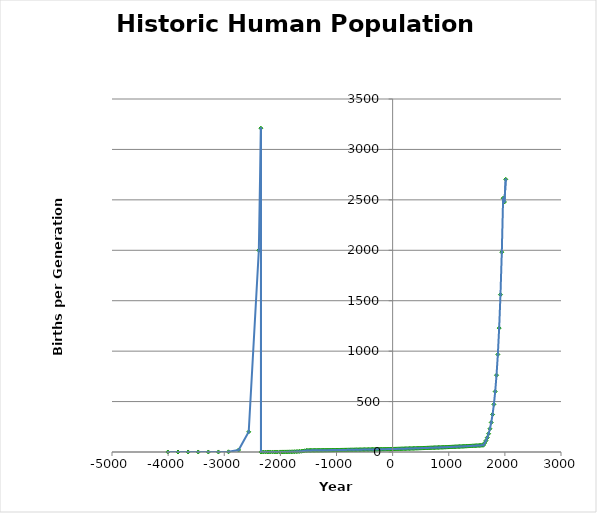
| Category | Series 0 |
|---|---|
| -4004.0 | 0 |
| -3824.0 | 0 |
| -3644.0 | 0 |
| -3464.0 | 0.002 |
| -3284.0 | 0.02 |
| -3104.0 | 0.2 |
| -2924.0 | 2 |
| -2744.0 | 20 |
| -2564.0 | 200 |
| -2384.0 | 2000 |
| -2347.0 | 3210.595 |
| -2346.0 | 0 |
| -2304.75 | 0 |
| -2263.5 | 0 |
| -2222.25 | 0 |
| -2181.0 | 0.002 |
| -2139.75 | 0.006 |
| -2098.5 | 0.025 |
| -2057.25 | 0.098 |
| -2014.0 | 0.421 |
| -1984.3 | 0.522 |
| -1954.6 | 0.652 |
| -1924.9 | 0.815 |
| -1895.2 | 1.019 |
| -1865.5 | 1.274 |
| -1835.8 | 1.592 |
| -1806.1 | 1.99 |
| -1776.4 | 2.488 |
| -1746.7 | 3.11 |
| -1717.0 | 3.887 |
| -1687.3 | 4.859 |
| -1657.6 | 6.074 |
| -1626.4 | 7.679 |
| -1595.2 | 9.707 |
| -1564.0 | 12.271 |
| -1532.8 | 15.513 |
| -1509.3 | 15.668 |
| -1485.8 | 15.825 |
| -1462.3 | 15.983 |
| -1438.8 | 16.143 |
| -1415.3 | 16.304 |
| -1391.8 | 16.467 |
| -1368.3 | 16.632 |
| -1344.8 | 16.798 |
| -1321.3 | 16.966 |
| -1297.8 | 17.136 |
| -1274.3 | 17.307 |
| -1250.8 | 17.48 |
| -1227.3 | 17.655 |
| -1203.8 | 17.832 |
| -1180.3 | 18.01 |
| -1156.8 | 18.19 |
| -1133.3 | 18.372 |
| -1109.8 | 18.556 |
| -1086.3 | 18.741 |
| -1062.8 | 18.929 |
| -1039.3 | 19.118 |
| -1015.8 | 19.309 |
| -992.299999999999 | 19.502 |
| -968.799999999999 | 19.697 |
| -945.299999999999 | 19.894 |
| -921.799999999999 | 20.093 |
| -898.299999999999 | 20.294 |
| -874.799999999999 | 20.497 |
| -851.299999999999 | 20.702 |
| -827.799999999999 | 20.909 |
| -804.299999999999 | 21.118 |
| -780.799999999999 | 21.329 |
| -757.299999999999 | 21.543 |
| -733.799999999999 | 21.758 |
| -710.299999999999 | 21.976 |
| -686.799999999999 | 22.195 |
| -663.299999999999 | 22.417 |
| -639.799999999999 | 22.642 |
| -616.299999999999 | 22.868 |
| -592.799999999999 | 23.097 |
| -569.299999999999 | 23.328 |
| -545.799999999999 | 23.561 |
| -522.299999999999 | 23.796 |
| -498.799999999999 | 24.034 |
| -475.299999999999 | 24.275 |
| -451.799999999999 | 24.518 |
| -428.299999999999 | 24.763 |
| -404.799999999999 | 25.01 |
| -381.299999999999 | 25.26 |
| -357.799999999999 | 25.513 |
| -334.299999999999 | 25.768 |
| -310.799999999999 | 26.026 |
| -287.299999999999 | 26.286 |
| -263.799999999999 | 26.549 |
| -240.299999999999 | 26.814 |
| -216.799999999999 | 27.083 |
| -193.299999999999 | 27.353 |
| -169.799999999999 | 27.627 |
| -146.299999999999 | 27.903 |
| -122.799999999999 | 28.182 |
| -99.2999999999993 | 28.464 |
| -75.7999999999993 | 28.749 |
| -52.2999999999993 | 29.036 |
| -28.7999999999993 | 29.327 |
| -5.29999999999927 | 29.62 |
| 18.2000000000007 | 29.916 |
| 41.7000000000007 | 30.275 |
| 65.2000000000007 | 30.638 |
| 88.7000000000007 | 31.006 |
| 112.200000000001 | 31.378 |
| 135.700000000001 | 31.755 |
| 159.200000000001 | 32.136 |
| 182.700000000001 | 32.521 |
| 206.200000000001 | 32.911 |
| 229.700000000001 | 33.306 |
| 253.200000000001 | 33.706 |
| 276.700000000001 | 34.111 |
| 300.200000000001 | 34.52 |
| 323.700000000001 | 34.934 |
| 347.200000000001 | 35.353 |
| 370.700000000001 | 35.778 |
| 394.200000000001 | 36.207 |
| 417.700000000001 | 36.641 |
| 441.200000000001 | 37.081 |
| 464.700000000001 | 37.526 |
| 488.200000000001 | 37.976 |
| 511.700000000001 | 38.432 |
| 535.200000000001 | 38.893 |
| 558.700000000001 | 39.36 |
| 582.200000000001 | 39.832 |
| 605.700000000001 | 40.31 |
| 629.200000000001 | 40.794 |
| 652.700000000001 | 41.284 |
| 676.200000000001 | 41.779 |
| 699.700000000001 | 42.28 |
| 723.200000000001 | 42.788 |
| 746.700000000001 | 43.301 |
| 770.200000000001 | 43.821 |
| 793.700000000001 | 44.347 |
| 817.200000000001 | 44.879 |
| 840.700000000001 | 45.417 |
| 864.200000000001 | 45.962 |
| 887.700000000001 | 46.514 |
| 911.200000000001 | 47.072 |
| 934.700000000001 | 47.637 |
| 958.200000000001 | 48.209 |
| 981.700000000001 | 48.787 |
| 1005.2 | 49.372 |
| 1028.7 | 49.965 |
| 1052.2 | 50.565 |
| 1075.7 | 51.171 |
| 1099.2 | 51.785 |
| 1122.7 | 52.407 |
| 1146.2 | 53.036 |
| 1169.7 | 53.672 |
| 1193.2 | 54.316 |
| 1216.7 | 54.968 |
| 1240.2 | 55.628 |
| 1263.7 | 56.295 |
| 1287.2 | 56.971 |
| 1310.7 | 57.654 |
| 1334.2 | 58.346 |
| 1357.7 | 59.046 |
| 1381.2 | 59.755 |
| 1404.7 | 60.472 |
| 1428.2 | 61.198 |
| 1451.7 | 61.932 |
| 1475.2 | 62.675 |
| 1498.7 | 63.427 |
| 1522.2 | 64.188 |
| 1545.7 | 64.959 |
| 1569.2 | 65.738 |
| 1592.7 | 66.527 |
| 1616.2 | 67.325 |
| 1639.7 | 88.618 |
| 1663.2 | 112.545 |
| 1686.7 | 142.932 |
| 1710.2 | 181.524 |
| 1733.7 | 230.535 |
| 1757.2 | 292.78 |
| 1780.7 | 371.83 |
| 1804.2 | 472.224 |
| 1827.7 | 599.725 |
| 1851.2 | 761.65 |
| 1874.7 | 967.296 |
| 1898.2 | 1228.466 |
| 1921.7 | 1560.152 |
| 1945.2 | 1981.393 |
| 1968.7 | 2516.369 |
| 1992.2 | 2479.013 |
| 2015.7 | 2703.256 |